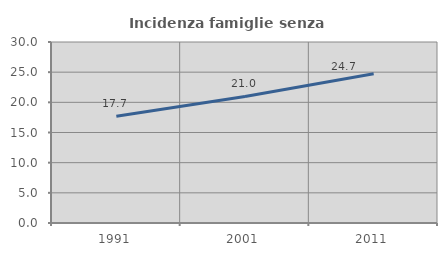
| Category | Incidenza famiglie senza nuclei |
|---|---|
| 1991.0 | 17.687 |
| 2001.0 | 20.981 |
| 2011.0 | 24.727 |